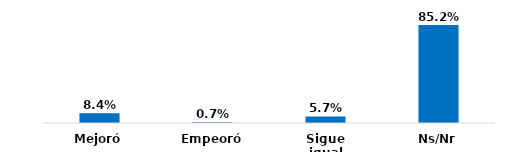
| Category | Series 0 |
|---|---|
| Mejoró | 0.084 |
| Empeoró | 0.007 |
| Sigue igual | 0.057 |
| Ns/Nr | 0.852 |